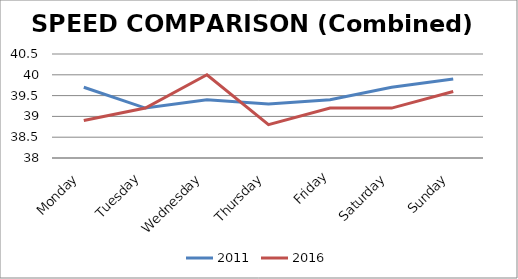
| Category | 2011 | 2016 |
|---|---|---|
| Monday | 39.7 | 38.9 |
| Tuesday | 39.2 | 39.2 |
| Wednesday | 39.4 | 40 |
| Thursday | 39.3 | 38.8 |
| Friday | 39.4 | 39.2 |
| Saturday | 39.7 | 39.2 |
| Sunday | 39.9 | 39.6 |